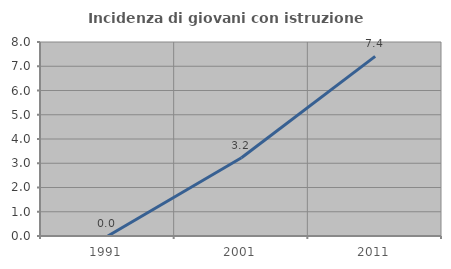
| Category | Incidenza di giovani con istruzione universitaria |
|---|---|
| 1991.0 | 0 |
| 2001.0 | 3.226 |
| 2011.0 | 7.407 |